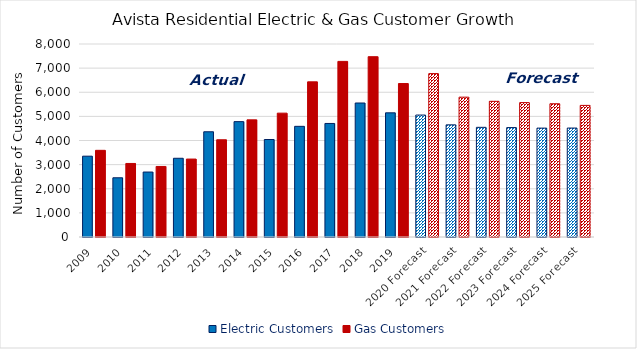
| Category | Electric Customers | Gas Customers |
|---|---|---|
| 2009 | 3350 | 3592 |
| 2010 | 2455 | 3048 |
| 2011 | 2693 | 2924 |
| 2012 | 3263 | 3230 |
| 2013 | 4362 | 4030 |
| 2014 | 4782 | 4855 |
| 2015 | 4041 | 5134 |
| 2016 | 4587 | 6431 |
| 2017 | 4706 | 7279 |
| 2018 | 5554 | 7474 |
| 2019 | 5147 | 6361 |
| 2020 Forecast | 5054.625 | 6772.848 |
| 2021 Forecast | 4648.817 | 5796.618 |
| 2022 Forecast | 4545.613 | 5623.964 |
| 2023 Forecast | 4535.249 | 5570.841 |
| 2024 Forecast | 4513.57 | 5523.722 |
| 2025 Forecast | 4515.788 | 5454.872 |